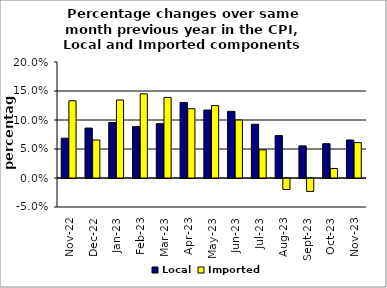
| Category | Local | Imported |
|---|---|---|
| 2022-11-01 | 0.069 | 0.133 |
| 2022-12-01 | 0.086 | 0.066 |
| 2023-01-01 | 0.096 | 0.134 |
| 2023-02-01 | 0.088 | 0.145 |
| 2023-03-01 | 0.094 | 0.139 |
| 2023-04-01 | 0.13 | 0.119 |
| 2023-05-01 | 0.117 | 0.125 |
| 2023-06-01 | 0.115 | 0.1 |
| 2023-07-01 | 0.093 | 0.049 |
| 2023-08-01 | 0.073 | -0.019 |
| 2023-09-01 | 0.055 | -0.022 |
| 2023-10-01 | 0.059 | 0.016 |
| 2023-11-01 | 0.065 | 0.061 |